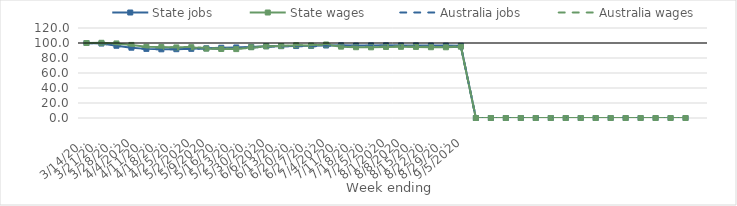
| Category | State jobs | State wages | Australia jobs | Australia wages |
|---|---|---|---|---|
| 14/03/2020 | 100 | 100 | 100 | 100 |
| 21/03/2020 | 99.257 | 100.288 | 99.287 | 99.672 |
| 28/03/2020 | 96.315 | 99.413 | 96.324 | 98.416 |
| 04/04/2020 | 93.738 | 97.433 | 93.668 | 96.718 |
| 11/04/2020 | 92.166 | 94.907 | 91.934 | 94.131 |
| 18/04/2020 | 91.584 | 94.551 | 91.469 | 94.023 |
| 25/04/2020 | 91.737 | 94.084 | 91.796 | 94.249 |
| 02/05/2020 | 92.224 | 94.414 | 92.192 | 94.719 |
| 09/05/2020 | 92.923 | 92.483 | 92.74 | 93.349 |
| 16/05/2020 | 93.642 | 92.012 | 93.27 | 92.686 |
| 23/05/2020 | 94.064 | 91.857 | 93.57 | 92.302 |
| 30/05/2020 | 94.707 | 94.331 | 94.082 | 93.6 |
| 06/06/2020 | 95.768 | 95.507 | 94.995 | 95.373 |
| 13/06/2020 | 95.775 | 95.942 | 95.458 | 96.064 |
| 20/06/2020 | 95.95 | 97.026 | 95.654 | 96.971 |
| 27/06/2020 | 96.167 | 96.616 | 95.59 | 97.092 |
| 04/07/2020 | 96.667 | 98.009 | 96.269 | 98.79 |
| 11/07/2020 | 96.88 | 95.146 | 96.518 | 95.694 |
| 18/07/2020 | 96.625 | 94.376 | 96.375 | 95.102 |
| 25/07/2020 | 96.807 | 94.267 | 96.44 | 94.758 |
| 01/08/2020 | 96.914 | 94.728 | 96.466 | 95.35 |
| 08/08/2020 | 96.761 | 94.925 | 96.196 | 95.604 |
| 15/08/2020 | 96.815 | 94.774 | 96.048 | 95.29 |
| 22/08/2020 | 96.62 | 94.372 | 95.872 | 94.881 |
| 29/08/2020 | 96.526 | 94.303 | 95.598 | 94.692 |
| 05/09/2020 | 96.323 | 95.08 | 95.533 | 95.73 |